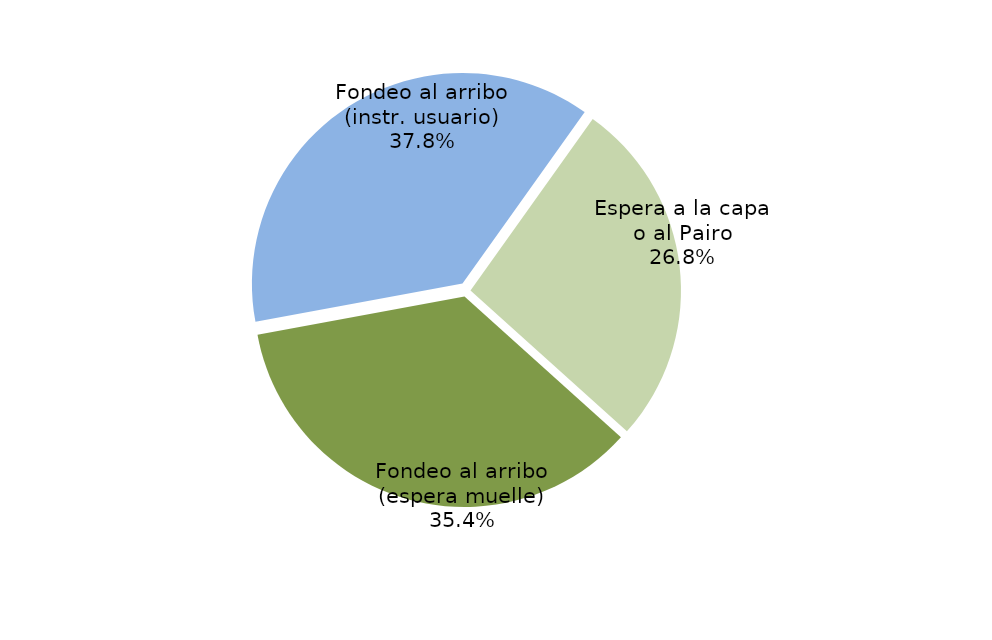
| Category | Series 0 |
|---|---|
| Fondeo al arribo (espera muelle) | 17920.4 |
| Fondeo al arribo (instr. usuario) | 19097.3 |
| Espera a la capa o al Pairo | 13558.117 |